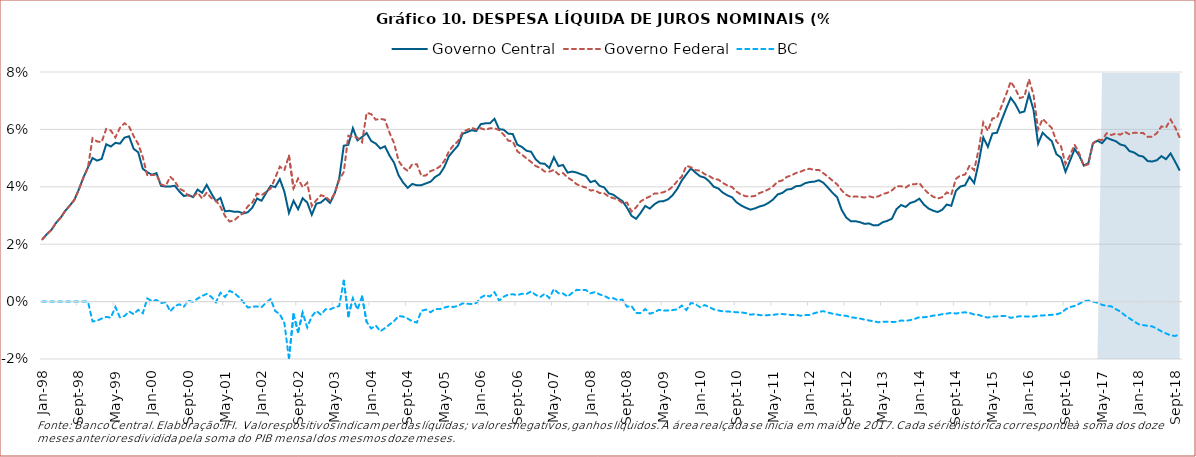
| Category | Governo Central | Governo Federal | BC |
|---|---|---|---|
| 1998-01-01 | 0.022 | 0.022 | 0 |
| 1998-02-01 | 0.023 | 0.023 | 0 |
| 1998-03-01 | 0.025 | 0.025 | 0 |
| 1998-04-01 | 0.027 | 0.027 | 0 |
| 1998-05-01 | 0.029 | 0.029 | 0 |
| 1998-06-01 | 0.032 | 0.032 | 0 |
| 1998-07-01 | 0.033 | 0.033 | 0 |
| 1998-08-01 | 0.035 | 0.035 | 0 |
| 1998-09-01 | 0.039 | 0.039 | 0 |
| 1998-10-01 | 0.043 | 0.043 | 0 |
| 1998-11-01 | 0.047 | 0.047 | 0 |
| 1998-12-01 | 0.05 | 0.057 | -0.007 |
| 1999-01-01 | 0.049 | 0.056 | -0.007 |
| 1999-02-01 | 0.05 | 0.056 | -0.006 |
| 1999-03-01 | 0.055 | 0.06 | -0.005 |
| 1999-04-01 | 0.054 | 0.06 | -0.006 |
| 1999-05-01 | 0.055 | 0.057 | -0.002 |
| 1999-06-01 | 0.055 | 0.061 | -0.005 |
| 1999-07-01 | 0.057 | 0.062 | -0.005 |
| 1999-08-01 | 0.058 | 0.061 | -0.003 |
| 1999-09-01 | 0.053 | 0.058 | -0.004 |
| 1999-10-01 | 0.052 | 0.055 | -0.003 |
| 1999-11-01 | 0.046 | 0.05 | -0.004 |
| 1999-12-01 | 0.045 | 0.044 | 0.001 |
| 2000-01-01 | 0.044 | 0.044 | 0 |
| 2000-02-01 | 0.045 | 0.044 | 0.001 |
| 2000-03-01 | 0.04 | 0.041 | -0.001 |
| 2000-04-01 | 0.04 | 0.04 | 0 |
| 2000-05-01 | 0.04 | 0.044 | -0.003 |
| 2000-06-01 | 0.04 | 0.042 | -0.002 |
| 2000-07-01 | 0.038 | 0.039 | -0.001 |
| 2000-08-01 | 0.037 | 0.039 | -0.002 |
| 2000-09-01 | 0.037 | 0.037 | 0 |
| 2000-10-01 | 0.036 | 0.037 | 0 |
| 2000-11-01 | 0.039 | 0.038 | 0.001 |
| 2000-12-01 | 0.038 | 0.036 | 0.002 |
| 2001-01-01 | 0.041 | 0.038 | 0.003 |
| 2001-02-01 | 0.038 | 0.036 | 0.002 |
| 2001-03-01 | 0.035 | 0.035 | 0 |
| 2001-04-01 | 0.036 | 0.033 | 0.003 |
| 2001-05-01 | 0.031 | 0.03 | 0.002 |
| 2001-06-01 | 0.032 | 0.028 | 0.004 |
| 2001-07-01 | 0.031 | 0.028 | 0.003 |
| 2001-08-01 | 0.031 | 0.03 | 0.002 |
| 2001-09-01 | 0.031 | 0.031 | 0 |
| 2001-10-01 | 0.031 | 0.033 | -0.002 |
| 2001-11-01 | 0.033 | 0.035 | -0.002 |
| 2001-12-01 | 0.036 | 0.038 | -0.002 |
| 2002-01-01 | 0.035 | 0.037 | -0.002 |
| 2002-02-01 | 0.038 | 0.038 | 0 |
| 2002-03-01 | 0.04 | 0.039 | 0.001 |
| 2002-04-01 | 0.04 | 0.043 | -0.003 |
| 2002-05-01 | 0.043 | 0.047 | -0.004 |
| 2002-06-01 | 0.038 | 0.046 | -0.008 |
| 2002-07-01 | 0.031 | 0.051 | -0.02 |
| 2002-08-01 | 0.035 | 0.04 | -0.004 |
| 2002-09-01 | 0.032 | 0.043 | -0.011 |
| 2002-10-01 | 0.036 | 0.04 | -0.004 |
| 2002-11-01 | 0.035 | 0.041 | -0.009 |
| 2002-12-01 | 0.03 | 0.033 | -0.005 |
| 2003-01-01 | 0.034 | 0.035 | -0.003 |
| 2003-02-01 | 0.035 | 0.037 | -0.005 |
| 2003-03-01 | 0.036 | 0.037 | -0.003 |
| 2003-04-01 | 0.034 | 0.035 | -0.003 |
| 2003-05-01 | 0.038 | 0.038 | -0.002 |
| 2003-06-01 | 0.043 | 0.042 | -0.002 |
| 2003-07-01 | 0.054 | 0.045 | 0.007 |
| 2003-08-01 | 0.055 | 0.058 | -0.005 |
| 2003-09-01 | 0.06 | 0.057 | 0.001 |
| 2003-10-01 | 0.056 | 0.057 | -0.003 |
| 2003-11-01 | 0.057 | 0.056 | 0.002 |
| 2003-12-01 | 0.059 | 0.066 | -0.007 |
| 2004-01-01 | 0.056 | 0.065 | -0.009 |
| 2004-02-01 | 0.055 | 0.063 | -0.008 |
| 2004-03-01 | 0.053 | 0.064 | -0.01 |
| 2004-04-01 | 0.054 | 0.063 | -0.009 |
| 2004-05-01 | 0.051 | 0.059 | -0.008 |
| 2004-06-01 | 0.048 | 0.055 | -0.007 |
| 2004-07-01 | 0.044 | 0.049 | -0.005 |
| 2004-08-01 | 0.041 | 0.047 | -0.005 |
| 2004-09-01 | 0.04 | 0.046 | -0.006 |
| 2004-10-01 | 0.041 | 0.048 | -0.007 |
| 2004-11-01 | 0.041 | 0.048 | -0.007 |
| 2004-12-01 | 0.041 | 0.044 | -0.003 |
| 2005-01-01 | 0.041 | 0.044 | -0.003 |
| 2005-02-01 | 0.042 | 0.045 | -0.004 |
| 2005-03-01 | 0.043 | 0.046 | -0.003 |
| 2005-04-01 | 0.044 | 0.047 | -0.003 |
| 2005-05-01 | 0.047 | 0.049 | -0.002 |
| 2005-06-01 | 0.051 | 0.052 | -0.002 |
| 2005-07-01 | 0.053 | 0.054 | -0.002 |
| 2005-08-01 | 0.054 | 0.056 | -0.002 |
| 2005-09-01 | 0.058 | 0.059 | -0.001 |
| 2005-10-01 | 0.059 | 0.06 | -0.001 |
| 2005-11-01 | 0.06 | 0.061 | -0.001 |
| 2005-12-01 | 0.059 | 0.06 | -0.001 |
| 2006-01-01 | 0.062 | 0.06 | 0.001 |
| 2006-02-01 | 0.062 | 0.06 | 0.002 |
| 2006-03-01 | 0.062 | 0.06 | 0.002 |
| 2006-04-01 | 0.064 | 0.06 | 0.003 |
| 2006-05-01 | 0.06 | 0.06 | 0 |
| 2006-06-01 | 0.06 | 0.058 | 0.002 |
| 2006-07-01 | 0.059 | 0.056 | 0.002 |
| 2006-08-01 | 0.058 | 0.056 | 0.003 |
| 2006-09-01 | 0.055 | 0.052 | 0.002 |
| 2006-10-01 | 0.054 | 0.051 | 0.003 |
| 2006-11-01 | 0.053 | 0.05 | 0.003 |
| 2006-12-01 | 0.052 | 0.049 | 0.004 |
| 2007-01-01 | 0.05 | 0.047 | 0.002 |
| 2007-02-01 | 0.048 | 0.047 | 0.002 |
| 2007-03-01 | 0.048 | 0.045 | 0.003 |
| 2007-04-01 | 0.047 | 0.045 | 0.001 |
| 2007-05-01 | 0.05 | 0.046 | 0.004 |
| 2007-06-01 | 0.047 | 0.044 | 0.003 |
| 2007-07-01 | 0.048 | 0.045 | 0.003 |
| 2007-08-01 | 0.045 | 0.043 | 0.002 |
| 2007-09-01 | 0.045 | 0.042 | 0.003 |
| 2007-10-01 | 0.045 | 0.041 | 0.004 |
| 2007-11-01 | 0.044 | 0.04 | 0.004 |
| 2007-12-01 | 0.044 | 0.04 | 0.004 |
| 2008-01-01 | 0.042 | 0.039 | 0.003 |
| 2008-02-01 | 0.042 | 0.039 | 0.003 |
| 2008-03-01 | 0.04 | 0.038 | 0.002 |
| 2008-04-01 | 0.04 | 0.038 | 0.002 |
| 2008-05-01 | 0.038 | 0.037 | 0.001 |
| 2008-06-01 | 0.037 | 0.036 | 0.001 |
| 2008-07-01 | 0.036 | 0.036 | 0 |
| 2008-08-01 | 0.035 | 0.034 | 0.001 |
| 2008-09-01 | 0.033 | 0.035 | -0.002 |
| 2008-10-01 | 0.03 | 0.031 | -0.002 |
| 2008-11-01 | 0.029 | 0.033 | -0.004 |
| 2008-12-01 | 0.031 | 0.035 | -0.004 |
| 2009-01-01 | 0.033 | 0.036 | -0.003 |
| 2009-02-01 | 0.032 | 0.037 | -0.004 |
| 2009-03-01 | 0.034 | 0.038 | -0.004 |
| 2009-04-01 | 0.035 | 0.038 | -0.003 |
| 2009-05-01 | 0.035 | 0.038 | -0.003 |
| 2009-06-01 | 0.036 | 0.039 | -0.003 |
| 2009-07-01 | 0.037 | 0.04 | -0.003 |
| 2009-08-01 | 0.039 | 0.042 | -0.003 |
| 2009-09-01 | 0.042 | 0.044 | -0.001 |
| 2009-10-01 | 0.044 | 0.047 | -0.003 |
| 2009-11-01 | 0.046 | 0.047 | 0 |
| 2009-12-01 | 0.045 | 0.046 | -0.001 |
| 2010-01-01 | 0.044 | 0.046 | -0.002 |
| 2010-02-01 | 0.043 | 0.044 | -0.001 |
| 2010-03-01 | 0.042 | 0.044 | -0.002 |
| 2010-04-01 | 0.04 | 0.043 | -0.003 |
| 2010-05-01 | 0.039 | 0.043 | -0.003 |
| 2010-06-01 | 0.038 | 0.041 | -0.003 |
| 2010-07-01 | 0.037 | 0.04 | -0.003 |
| 2010-08-01 | 0.036 | 0.04 | -0.004 |
| 2010-09-01 | 0.035 | 0.038 | -0.004 |
| 2010-10-01 | 0.034 | 0.037 | -0.004 |
| 2010-11-01 | 0.033 | 0.037 | -0.004 |
| 2010-12-01 | 0.032 | 0.037 | -0.005 |
| 2011-01-01 | 0.032 | 0.037 | -0.004 |
| 2011-02-01 | 0.033 | 0.038 | -0.005 |
| 2011-03-01 | 0.034 | 0.038 | -0.005 |
| 2011-04-01 | 0.034 | 0.039 | -0.005 |
| 2011-05-01 | 0.036 | 0.04 | -0.005 |
| 2011-06-01 | 0.037 | 0.042 | -0.004 |
| 2011-07-01 | 0.038 | 0.042 | -0.004 |
| 2011-08-01 | 0.039 | 0.043 | -0.004 |
| 2011-09-01 | 0.039 | 0.044 | -0.005 |
| 2011-10-01 | 0.04 | 0.045 | -0.005 |
| 2011-11-01 | 0.04 | 0.045 | -0.005 |
| 2011-12-01 | 0.041 | 0.046 | -0.005 |
| 2012-01-01 | 0.042 | 0.046 | -0.005 |
| 2012-02-01 | 0.042 | 0.046 | -0.004 |
| 2012-03-01 | 0.042 | 0.046 | -0.004 |
| 2012-04-01 | 0.041 | 0.045 | -0.003 |
| 2012-05-01 | 0.04 | 0.044 | -0.004 |
| 2012-06-01 | 0.038 | 0.042 | -0.004 |
| 2012-07-01 | 0.036 | 0.041 | -0.004 |
| 2012-08-01 | 0.032 | 0.039 | -0.005 |
| 2012-09-01 | 0.029 | 0.037 | -0.005 |
| 2012-10-01 | 0.028 | 0.036 | -0.005 |
| 2012-11-01 | 0.028 | 0.037 | -0.006 |
| 2012-12-01 | 0.028 | 0.036 | -0.006 |
| 2013-01-01 | 0.027 | 0.036 | -0.006 |
| 2013-02-01 | 0.027 | 0.037 | -0.007 |
| 2013-03-01 | 0.027 | 0.036 | -0.007 |
| 2013-04-01 | 0.027 | 0.037 | -0.007 |
| 2013-05-01 | 0.028 | 0.037 | -0.007 |
| 2013-06-01 | 0.028 | 0.038 | -0.007 |
| 2013-07-01 | 0.029 | 0.039 | -0.007 |
| 2013-08-01 | 0.032 | 0.04 | -0.007 |
| 2013-09-01 | 0.034 | 0.04 | -0.007 |
| 2013-10-01 | 0.033 | 0.04 | -0.007 |
| 2013-11-01 | 0.034 | 0.041 | -0.006 |
| 2013-12-01 | 0.035 | 0.041 | -0.006 |
| 2014-01-01 | 0.036 | 0.041 | -0.005 |
| 2014-02-01 | 0.034 | 0.039 | -0.005 |
| 2014-03-01 | 0.032 | 0.038 | -0.005 |
| 2014-04-01 | 0.032 | 0.037 | -0.005 |
| 2014-05-01 | 0.031 | 0.036 | -0.005 |
| 2014-06-01 | 0.032 | 0.036 | -0.004 |
| 2014-07-01 | 0.034 | 0.038 | -0.004 |
| 2014-08-01 | 0.033 | 0.037 | -0.004 |
| 2014-09-01 | 0.039 | 0.043 | -0.004 |
| 2014-10-01 | 0.04 | 0.044 | -0.004 |
| 2014-11-01 | 0.041 | 0.044 | -0.004 |
| 2014-12-01 | 0.043 | 0.047 | -0.004 |
| 2015-01-01 | 0.041 | 0.046 | -0.004 |
| 2015-02-01 | 0.048 | 0.053 | -0.005 |
| 2015-03-01 | 0.057 | 0.062 | -0.005 |
| 2015-04-01 | 0.054 | 0.059 | -0.006 |
| 2015-05-01 | 0.059 | 0.064 | -0.005 |
| 2015-06-01 | 0.059 | 0.064 | -0.005 |
| 2015-07-01 | 0.063 | 0.068 | -0.005 |
| 2015-08-01 | 0.067 | 0.072 | -0.005 |
| 2015-09-01 | 0.071 | 0.077 | -0.006 |
| 2015-10-01 | 0.069 | 0.074 | -0.005 |
| 2015-11-01 | 0.066 | 0.071 | -0.005 |
| 2015-12-01 | 0.066 | 0.071 | -0.005 |
| 2016-01-01 | 0.072 | 0.077 | -0.005 |
| 2016-02-01 | 0.067 | 0.072 | -0.005 |
| 2016-03-01 | 0.055 | 0.06 | -0.005 |
| 2016-04-01 | 0.059 | 0.064 | -0.005 |
| 2016-05-01 | 0.057 | 0.062 | -0.005 |
| 2016-06-01 | 0.056 | 0.06 | -0.005 |
| 2016-07-01 | 0.051 | 0.056 | -0.004 |
| 2016-08-01 | 0.05 | 0.054 | -0.004 |
| 2016-09-01 | 0.045 | 0.048 | -0.003 |
| 2016-10-01 | 0.049 | 0.051 | -0.002 |
| 2016-11-01 | 0.053 | 0.055 | -0.002 |
| 2016-12-01 | 0.051 | 0.052 | -0.001 |
| 2017-01-01 | 0.047 | 0.047 | 0 |
| 2017-02-01 | 0.048 | 0.048 | 0 |
| 2017-03-01 | 0.055 | 0.055 | 0 |
| 2017-04-01 | 0.056 | 0.056 | 0 |
| 2017-05-01 | 0.055 | 0.056 | -0.001 |
| 2017-06-01 | 0.057 | 0.059 | -0.002 |
| 2017-07-01 | 0.056 | 0.058 | -0.002 |
| 2017-08-01 | 0.056 | 0.059 | -0.003 |
| 2017-09-01 | 0.055 | 0.058 | -0.003 |
| 2017-10-01 | 0.054 | 0.059 | -0.005 |
| 2017-11-01 | 0.052 | 0.058 | -0.006 |
| 2017-12-01 | 0.052 | 0.059 | -0.007 |
| 2018-01-01 | 0.051 | 0.059 | -0.008 |
| 2018-02-01 | 0.051 | 0.059 | -0.008 |
| 2018-03-01 | 0.049 | 0.057 | -0.008 |
| 2018-04-01 | 0.049 | 0.057 | -0.009 |
| 2018-05-01 | 0.049 | 0.059 | -0.009 |
| 2018-06-01 | 0.051 | 0.061 | -0.01 |
| 2018-07-01 | 0.05 | 0.061 | -0.011 |
| 2018-08-01 | 0.052 | 0.063 | -0.012 |
| 2018-09-01 | 0.049 | 0.061 | -0.012 |
| 2018-10-01 | 0.046 | 0.057 | -0.011 |